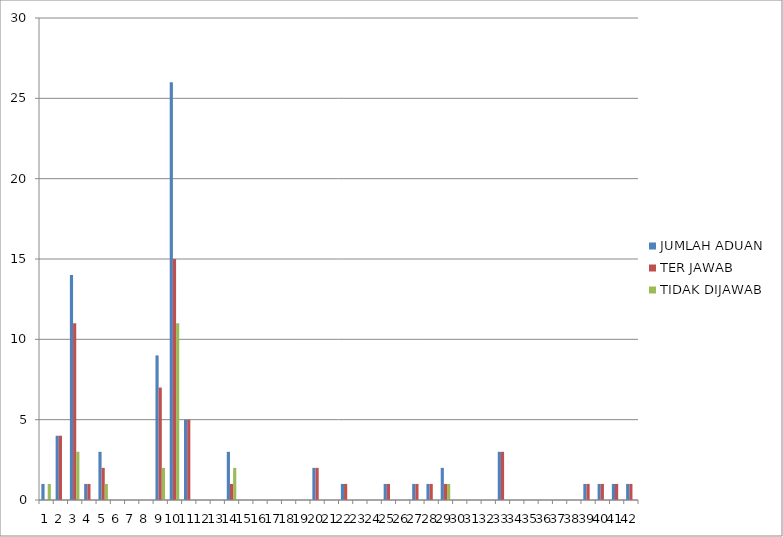
| Category | JUMLAH ADUAN | TER JAWAB | TIDAK DIJAWAB |
|---|---|---|---|
| 0 | 1 | 0 | 1 |
| 1 | 4 | 4 | 0 |
| 2 | 14 | 11 | 3 |
| 3 | 1 | 1 | 0 |
| 4 | 3 | 2 | 1 |
| 5 | 0 | 0 | 0 |
| 6 | 0 | 0 | 0 |
| 7 | 0 | 0 | 0 |
| 8 | 9 | 7 | 2 |
| 9 | 26 | 15 | 11 |
| 10 | 5 | 5 | 0 |
| 11 | 0 | 0 | 0 |
| 12 | 0 | 0 | 0 |
| 13 | 3 | 1 | 2 |
| 14 | 0 | 0 | 0 |
| 15 | 0 | 0 | 0 |
| 16 | 0 | 0 | 0 |
| 17 | 0 | 0 | 0 |
| 18 | 0 | 0 | 0 |
| 19 | 2 | 2 | 0 |
| 20 | 0 | 0 | 0 |
| 21 | 1 | 1 | 0 |
| 22 | 0 | 0 | 0 |
| 23 | 0 | 0 | 0 |
| 24 | 1 | 1 | 0 |
| 25 | 0 | 0 | 0 |
| 26 | 1 | 1 | 0 |
| 27 | 1 | 1 | 0 |
| 28 | 2 | 1 | 1 |
| 29 | 0 | 0 | 0 |
| 30 | 0 | 0 | 0 |
| 31 | 0 | 0 | 0 |
| 32 | 3 | 3 | 0 |
| 33 | 0 | 0 | 0 |
| 34 | 0 | 0 | 0 |
| 35 | 0 | 0 | 0 |
| 36 | 0 | 0 | 0 |
| 37 | 0 | 0 | 0 |
| 38 | 1 | 1 | 0 |
| 39 | 1 | 1 | 0 |
| 40 | 1 | 1 | 0 |
| 41 | 1 | 1 | 0 |